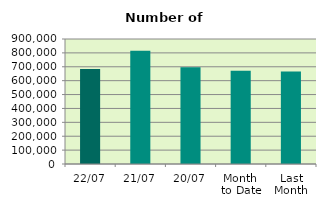
| Category | Series 0 |
|---|---|
| 22/07 | 684502 |
| 21/07 | 815396 |
| 20/07 | 695758 |
| Month 
to Date | 670629.875 |
| Last
Month | 666251.273 |